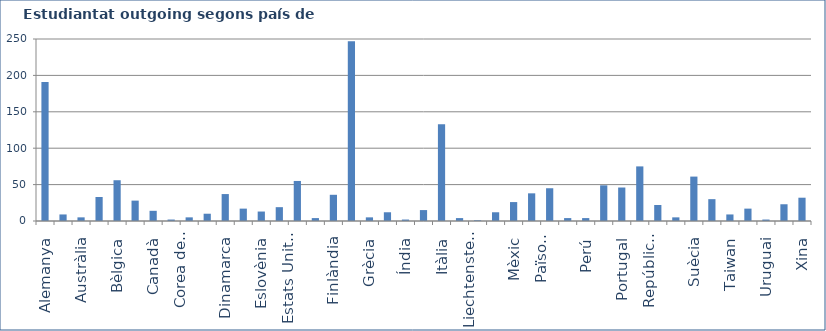
| Category | Nre Estudiantat |
|---|---|
| Alemanya | 191 |
| Argentina | 9 |
| Austràlia | 5 |
| Àustria | 33 |
| Bèlgica | 56 |
| Brasil | 28 |
| Canadà | 14 |
| Colòmbia | 2 |
| Corea del Sud | 5 |
| Croàcia | 10 |
| Dinamarca | 37 |
| Eslovàquia | 17 |
| Eslovènia | 13 |
| Espanya | 19 |
| Estats Units d'Amèrica | 55 |
| Estònia | 4 |
| Finlàndia | 36 |
| França | 247 |
| Grècia | 5 |
| Hongria | 12 |
| Índia | 2 |
| Irlanda | 15 |
| Itàlia | 133 |
| Japó | 4 |
| Liechtenstein | 1 |
| Lituània | 12 |
| Mèxic | 26 |
| Noruega | 38 |
| Països Baixos | 45 |
| Panamà | 4 |
| Perú | 4 |
| Polònia | 49 |
| Portugal | 46 |
| Regne Unit | 75 |
| República Txeca | 22 |
| Romania | 5 |
| Suècia | 61 |
| Suïssa | 30 |
| Taiwan | 9 |
| Turquia | 17 |
| Uruguai | 2 |
| Xile | 23 |
| Xina | 32 |